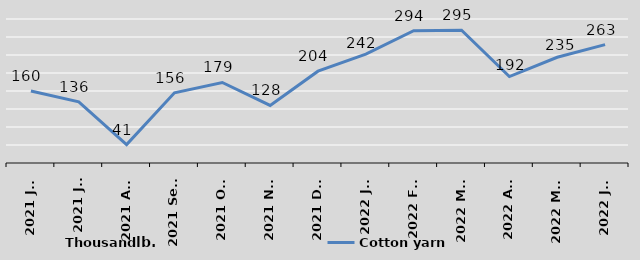
| Category | Cotton yarn
 |
|---|---|
| 2021 Jun | 160 |
| 2021 Jul | 136 |
| 2021 Aug | 41 |
| 2021 Sept | 156 |
| 2021 Oct | 179 |
| 2021 Nov | 128 |
| 2021 Dec | 204 |
| 2022 Jan | 242 |
| 2022 Feb | 294 |
| 2022 Mar | 295 |
| 2022 Apr | 192 |
| 2022 May | 235 |
| 2022 Jun | 263 |